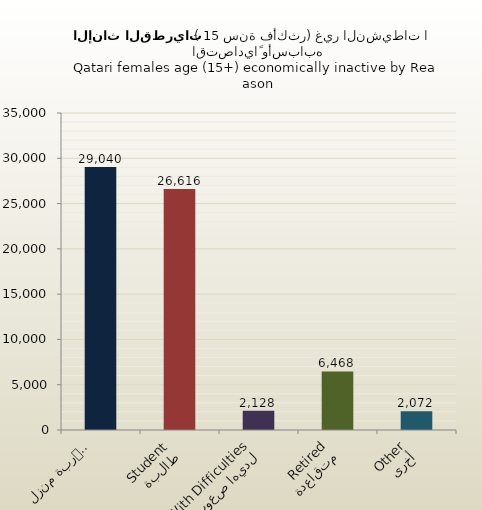
| Category | الاناث القطريات |
|---|---|
| ربة منزل
Homemaker | 29040 |
| طالبة
Student | 26616 |
| لديها صعوبات
With Difficulties | 2128 |
| متقاعدة
Retired | 6468 |
| أخرى
Other | 2072 |